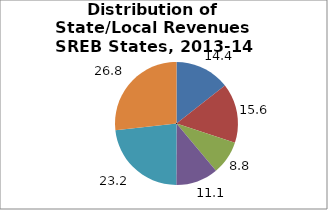
| Category | Series 0 |
|---|---|
| General Sales | 14.432 |
| Property | 15.632 |
| Income1 | 8.846 |
| Other | 11.138 |
| From Federal Government | 23.195 |
| Nontax Revenues2 | 26.758 |